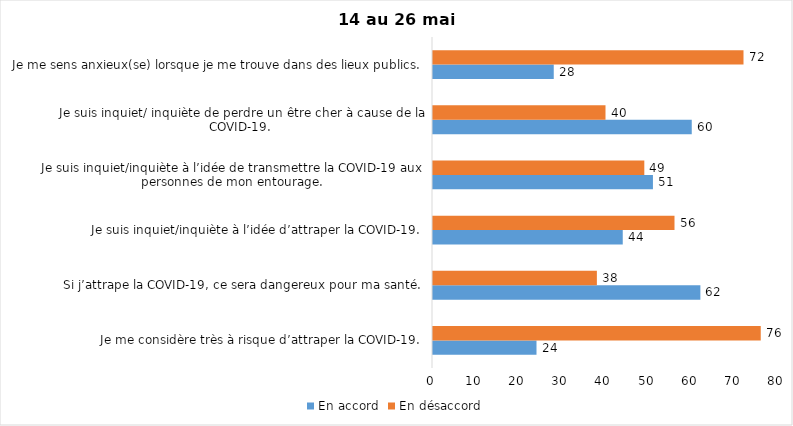
| Category | En accord | En désaccord |
|---|---|---|
| Je me considère très à risque d’attraper la COVID-19. | 24 | 76 |
| Si j’attrape la COVID-19, ce sera dangereux pour ma santé. | 62 | 38 |
| Je suis inquiet/inquiète à l’idée d’attraper la COVID-19. | 44 | 56 |
| Je suis inquiet/inquiète à l’idée de transmettre la COVID-19 aux personnes de mon entourage. | 51 | 49 |
| Je suis inquiet/ inquiète de perdre un être cher à cause de la COVID-19. | 60 | 40 |
| Je me sens anxieux(se) lorsque je me trouve dans des lieux publics. | 28 | 72 |